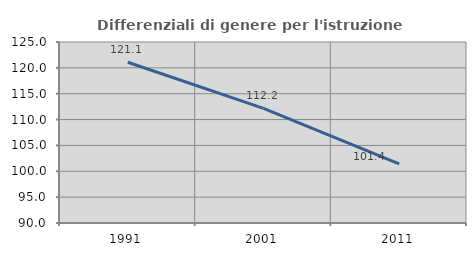
| Category | Differenziali di genere per l'istruzione superiore |
|---|---|
| 1991.0 | 121.076 |
| 2001.0 | 112.177 |
| 2011.0 | 101.421 |